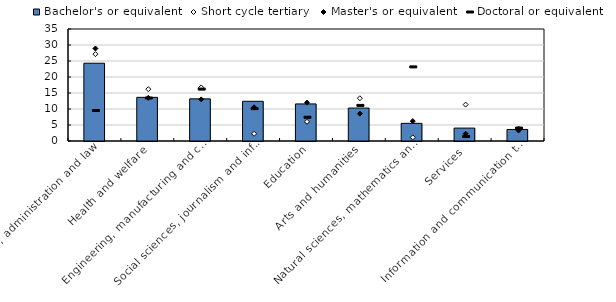
| Category | Bachelor's or equivalent |
|---|---|
| Business, administration and law | 24.303 |
| Health and welfare | 13.642 |
| Engineering, manufacturing and construction | 13.167 |
| Social sciences, journalism and information | 12.411 |
| Education | 11.585 |
| Arts and humanities | 10.295 |
| Natural sciences, mathematics and statistics | 5.516 |
| Services | 4.038 |
| Information and communication technologies | 3.605 |